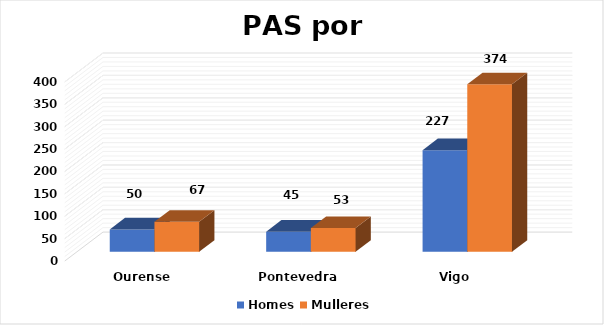
| Category | Homes | Mulleres |
|---|---|---|
| Ourense | 50 | 67 |
| Pontevedra | 45 | 53 |
| Vigo | 227 | 374 |